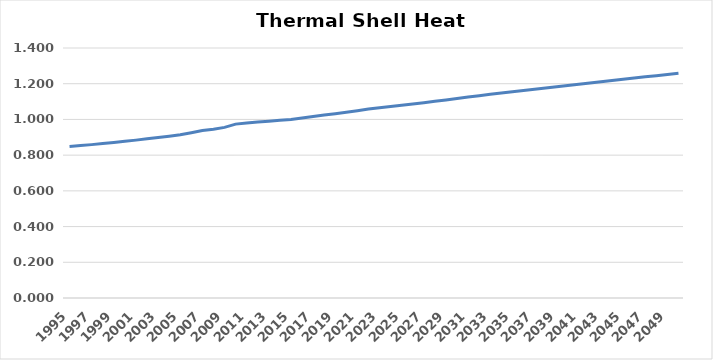
| Category | BSE Index Heat |
|---|---|
| 1995.0 | 0.848 |
| 1996.0 | 0.853 |
| 1997.0 | 0.859 |
| 1998.0 | 0.865 |
| 1999.0 | 0.871 |
| 2000.0 | 0.877 |
| 2001.0 | 0.884 |
| 2002.0 | 0.891 |
| 2003.0 | 0.899 |
| 2004.0 | 0.906 |
| 2005.0 | 0.914 |
| 2006.0 | 0.926 |
| 2007.0 | 0.938 |
| 2008.0 | 0.945 |
| 2009.0 | 0.955 |
| 2010.0 | 0.974 |
| 2011.0 | 0.98 |
| 2012.0 | 0.986 |
| 2013.0 | 0.99 |
| 2014.0 | 0.995 |
| 2015.0 | 1 |
| 2016.0 | 1.008 |
| 2017.0 | 1.016 |
| 2018.0 | 1.025 |
| 2019.0 | 1.032 |
| 2020.0 | 1.04 |
| 2021.0 | 1.049 |
| 2022.0 | 1.058 |
| 2023.0 | 1.066 |
| 2024.0 | 1.073 |
| 2025.0 | 1.08 |
| 2026.0 | 1.087 |
| 2027.0 | 1.094 |
| 2028.0 | 1.101 |
| 2029.0 | 1.109 |
| 2030.0 | 1.117 |
| 2031.0 | 1.125 |
| 2032.0 | 1.133 |
| 2033.0 | 1.141 |
| 2034.0 | 1.148 |
| 2035.0 | 1.155 |
| 2036.0 | 1.162 |
| 2037.0 | 1.17 |
| 2038.0 | 1.177 |
| 2039.0 | 1.184 |
| 2040.0 | 1.191 |
| 2041.0 | 1.198 |
| 2042.0 | 1.204 |
| 2043.0 | 1.211 |
| 2044.0 | 1.218 |
| 2045.0 | 1.225 |
| 2046.0 | 1.232 |
| 2047.0 | 1.238 |
| 2048.0 | 1.245 |
| 2049.0 | 1.252 |
| 2050.0 | 1.258 |